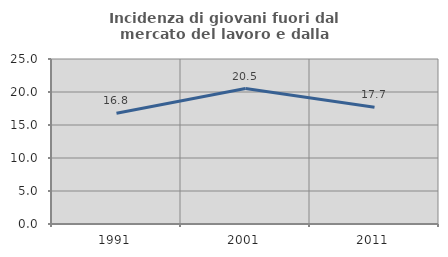
| Category | Incidenza di giovani fuori dal mercato del lavoro e dalla formazione  |
|---|---|
| 1991.0 | 16.77 |
| 2001.0 | 20.526 |
| 2011.0 | 17.69 |